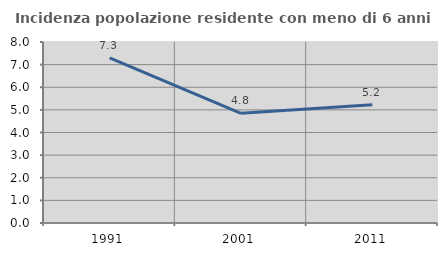
| Category | Incidenza popolazione residente con meno di 6 anni |
|---|---|
| 1991.0 | 7.296 |
| 2001.0 | 4.849 |
| 2011.0 | 5.226 |